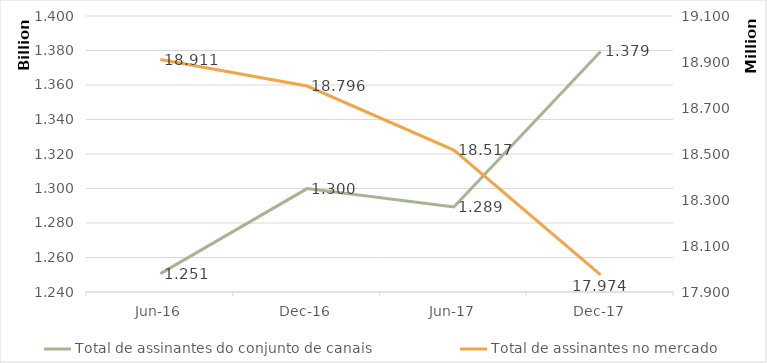
| Category | Total de assinantes do conjunto de canais |
|---|---|
| 2016-06-01 | 1250659306.865 |
| 2016-12-01 | 1299931708.608 |
| 2017-06-01 | 1289279373.454 |
| 2017-12-01 | 1379429684.111 |